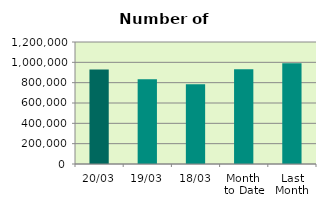
| Category | Series 0 |
|---|---|
| 20/03 | 929986 |
| 19/03 | 833346 |
| 18/03 | 784412 |
| Month 
to Date | 933051.286 |
| Last
Month | 989849.1 |